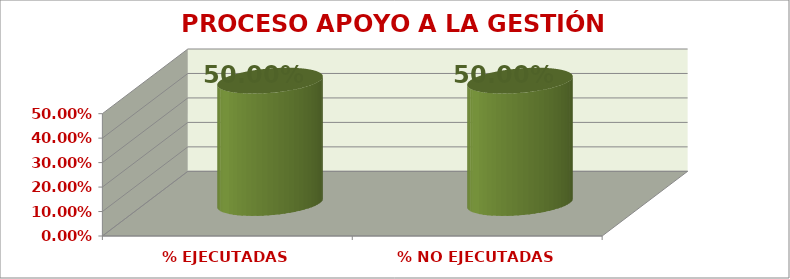
| Category | PROCESO APOYO A LA GESTIÓN ACADÉMICA |
|---|---|
| % EJECUTADAS | 0.5 |
| % NO EJECUTADAS | 0.5 |